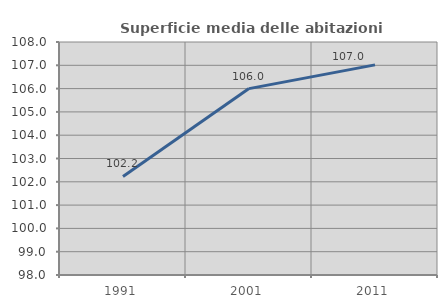
| Category | Superficie media delle abitazioni occupate |
|---|---|
| 1991.0 | 102.229 |
| 2001.0 | 106 |
| 2011.0 | 107.017 |